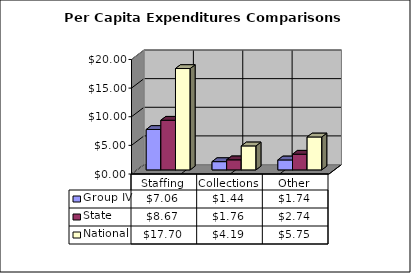
| Category | Group IV | State | National |
|---|---|---|---|
| Staffing | 7.058 | 8.673 | 17.7 |
| Collections | 1.443 | 1.759 | 4.19 |
| Other | 1.739 | 2.74 | 5.75 |